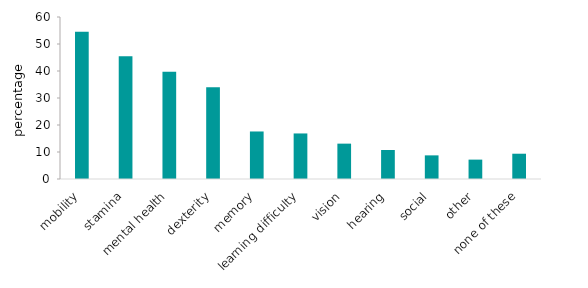
| Category | Series 0 |
|---|---|
|  mobility | 54.493 |
|  stamina | 45.467 |
|  mental health | 39.739 |
| dexterity | 33.99 |
|  memory | 17.601 |
|  learning difficulty | 16.87 |
|  vision | 13.096 |
| hearing | 10.745 |
|  social | 8.753 |
|  other | 7.177 |
|  none of these | 9.364 |